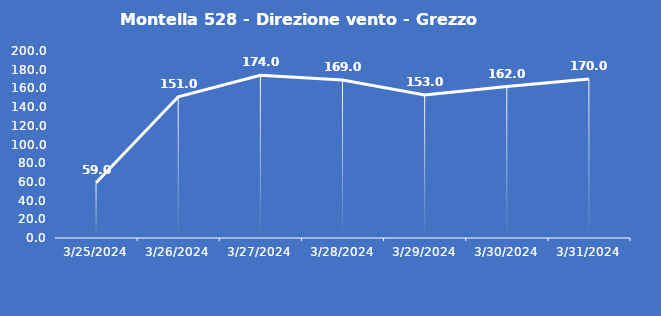
| Category | Montella 528 - Direzione vento - Grezzo (°N) |
|---|---|
| 3/25/24 | 59 |
| 3/26/24 | 151 |
| 3/27/24 | 174 |
| 3/28/24 | 169 |
| 3/29/24 | 153 |
| 3/30/24 | 162 |
| 3/31/24 | 170 |